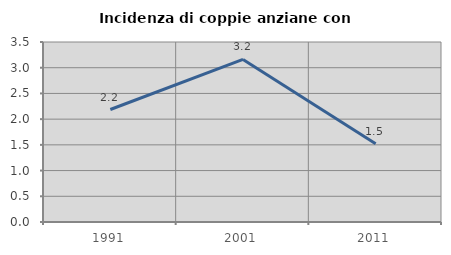
| Category | Incidenza di coppie anziane con figli |
|---|---|
| 1991.0 | 2.188 |
| 2001.0 | 3.161 |
| 2011.0 | 1.523 |